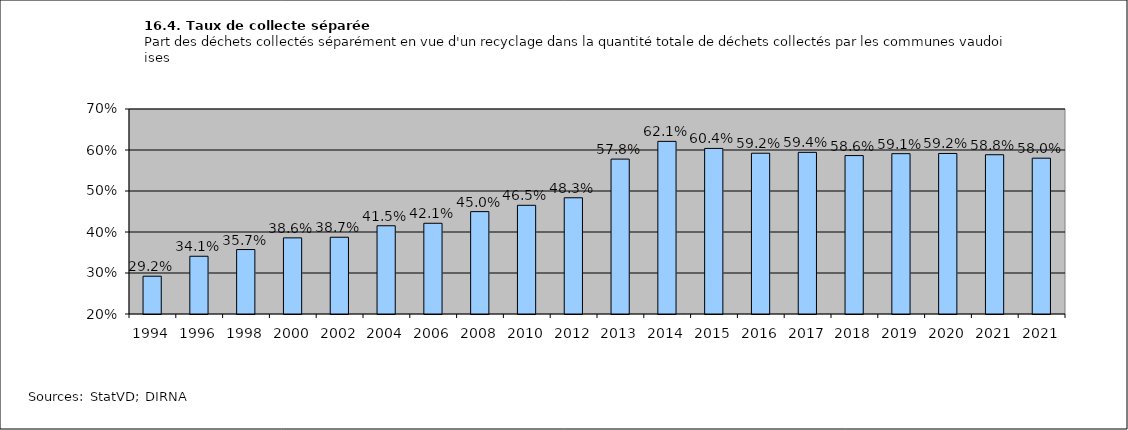
| Category | Taux de collecte séparée |
|---|---|
| 1994.0 | 0.292 |
| 1996.0 | 0.341 |
| 1998.0 | 0.357 |
| 2000.0 | 0.386 |
| 2002.0 | 0.387 |
| 2004.0 | 0.415 |
| 2006.0 | 0.421 |
| 2008.0 | 0.45 |
| 2010.0 | 0.465 |
| 2012.0 | 0.483 |
| 2013.0 | 0.578 |
| 2014.0 | 0.621 |
| 2015.0 | 0.604 |
| 2016.0 | 0.592 |
| 2017.0 | 0.594 |
| 2018.0 | 0.586 |
| 2019.0 | 0.591 |
| 2020.0 | 0.592 |
| 2021.0 | 0.588 |
| 2021.0 | 0.58 |